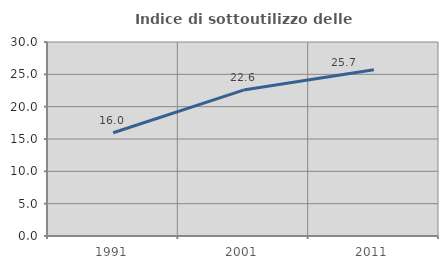
| Category | Indice di sottoutilizzo delle abitazioni  |
|---|---|
| 1991.0 | 15.967 |
| 2001.0 | 22.564 |
| 2011.0 | 25.707 |